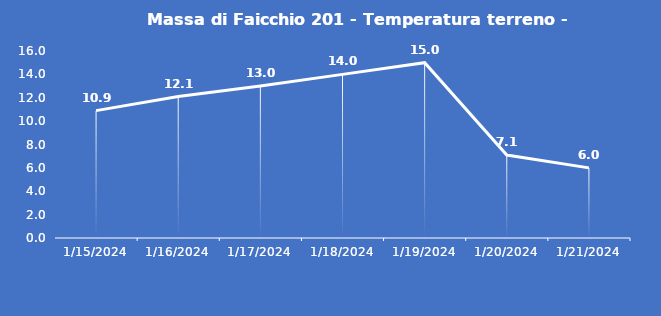
| Category | Massa di Faicchio 201 - Temperatura terreno - Grezzo (°C) |
|---|---|
| 1/15/24 | 10.9 |
| 1/16/24 | 12.1 |
| 1/17/24 | 13 |
| 1/18/24 | 14 |
| 1/19/24 | 15 |
| 1/20/24 | 7.1 |
| 1/21/24 | 6 |